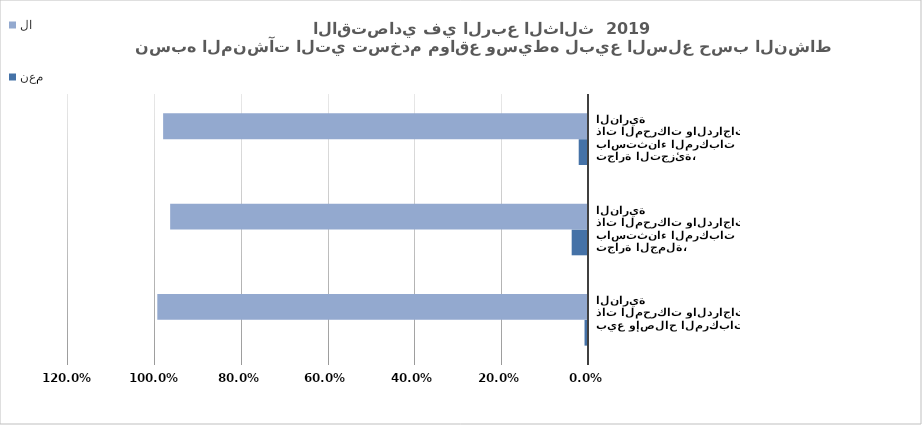
| Category | نعم | لا |
|---|---|---|
| بيع وإصلاح المركبات ذات المحركات والدراجات النارية | 0.008 | 0.992 |
| تجارة الجملة، باستثناء المركبات ذات المحركات والدراجات النارية | 0.038 | 0.962 |
| تجارة التجزئة، باستثناء المركبات ذات المحركات والدراجات النارية | 0.021 | 0.979 |